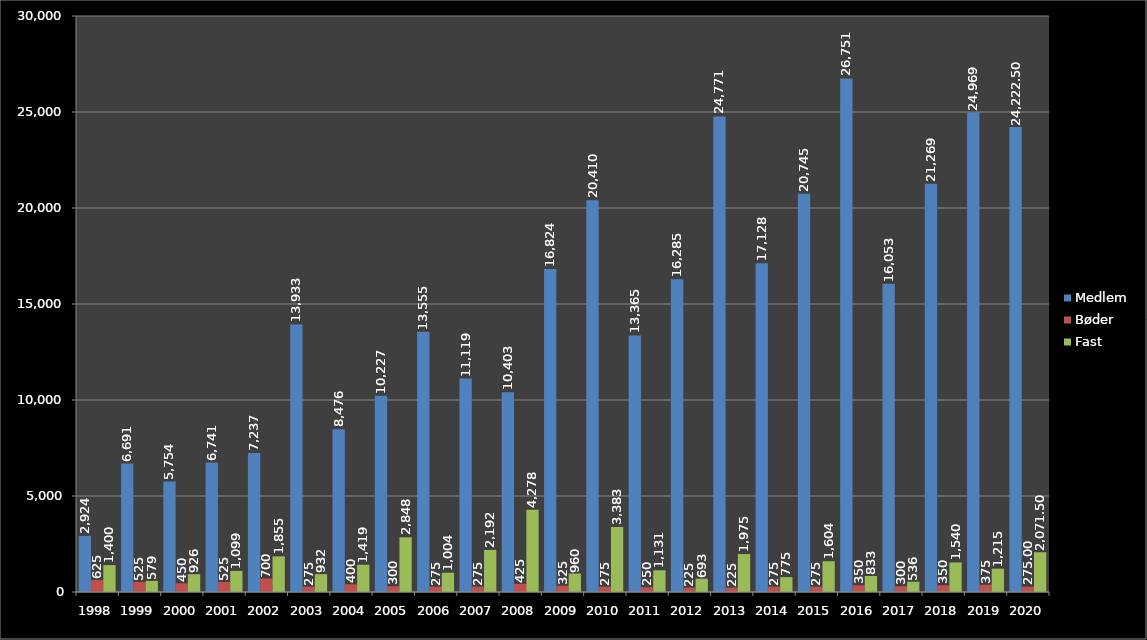
| Category | Medlem | Bøder | Fast |
|---|---|---|---|
| 1998.0 | 2924 | 625 | 1400 |
| 1999.0 | 6691 | 525 | 579 |
| 2000.0 | 5754 | 450 | 926 |
| 2001.0 | 6741 | 525 | 1099 |
| 2002.0 | 7237 | 700 | 1855 |
| 2003.0 | 13933 | 275 | 932 |
| 2004.0 | 8476 | 400 | 1419 |
| 2005.0 | 10227 | 300 | 2848 |
| 2006.0 | 13555 | 275 | 1004 |
| 2007.0 | 11119 | 275 | 2192 |
| 2008.0 | 10403 | 425 | 4278 |
| 2009.0 | 16824 | 325 | 960 |
| 2010.0 | 20410 | 275 | 3383 |
| 2011.0 | 13365 | 250 | 1131 |
| 2012.0 | 16285 | 225 | 693 |
| 2013.0 | 24771 | 225 | 1975 |
| 2014.0 | 17128 | 275 | 775 |
| 2015.0 | 20745 | 275 | 1604 |
| 2016.0 | 26751 | 350 | 833 |
| 2017.0 | 16053 | 300 | 536 |
| 2018.0 | 21269 | 350 | 1540 |
| 2019.0 | 24969 | 375 | 1215 |
| 2020.0 | 24222.5 | 275 | 2071.5 |